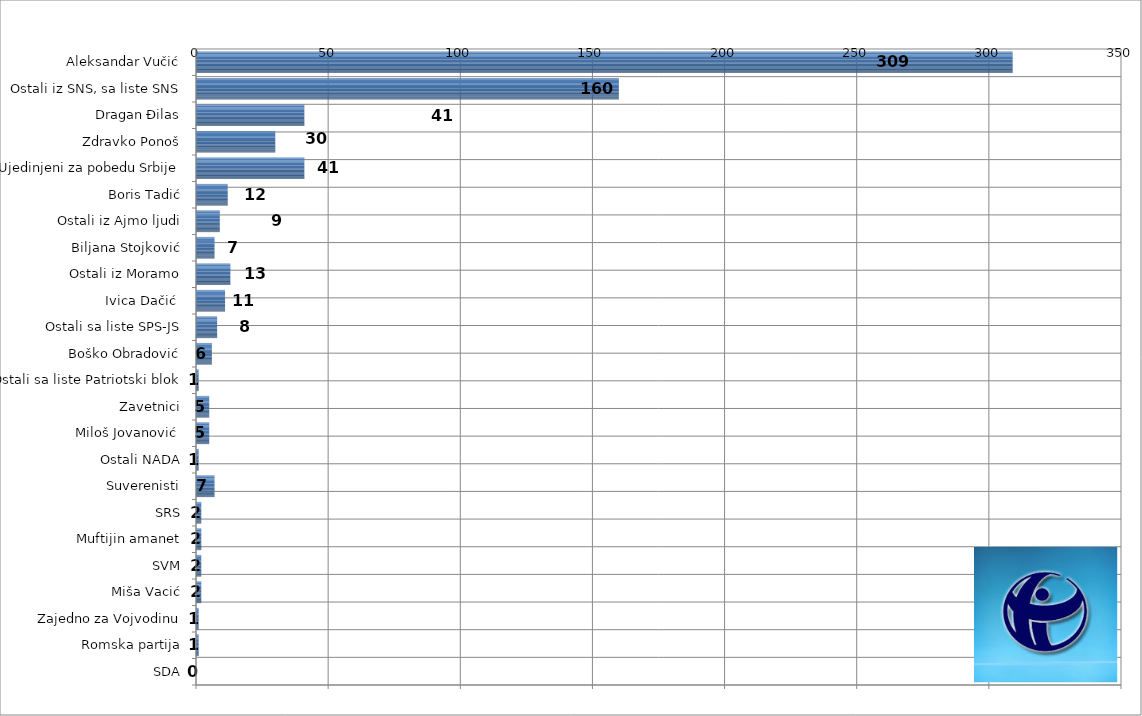
| Category | Series 0 |
|---|---|
| Aleksandar Vučić | 309 |
| Ostali iz SNS, sa liste SNS | 160 |
| Dragan Đilas | 41 |
| Zdravko Ponoš | 30 |
| Ostali sa listi Ujedinjeni za pobedu Srbije | 41 |
| Boris Tadić | 12 |
| Ostali iz Ajmo ljudi | 9 |
| Biljana Stojković | 7 |
| Ostali iz Moramo | 13 |
| Ivica Dačić  | 11 |
| Ostali sa liste SPS-JS | 8 |
| Boško Obradović | 6 |
| Ostali sa liste Patriotski blok | 1 |
| Zavetnici | 5 |
| Miloš Jovanović  | 5 |
| Ostali NADA | 1 |
| Suverenisti | 7 |
| SRS | 2 |
| Muftijin amanet | 2 |
| SVM | 2 |
| Miša Vacić | 2 |
| Zajedno za Vojvodinu | 1 |
| Romska partija | 1 |
| SDA | 0 |